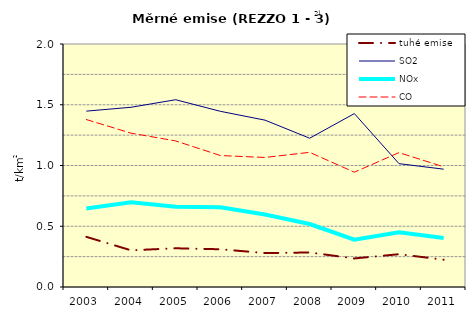
| Category | tuhé emise | SO2 | NOx | CO |
|---|---|---|---|---|
| 2003.0 | 0.413 | 1.447 | 0.646 | 1.378 |
| 2004.0 | 0.302 | 1.479 | 0.697 | 1.266 |
| 2005.0 | 0.319 | 1.541 | 0.661 | 1.202 |
| 2006.0 | 0.311 | 1.446 | 0.657 | 1.082 |
| 2007.0 | 0.279 | 1.373 | 0.596 | 1.066 |
| 2008.0 | 0.284 | 1.225 | 0.518 | 1.108 |
| 2009.0 | 0.235 | 1.427 | 0.389 | 0.945 |
| 2010.0 | 0.27 | 1.015 | 0.451 | 1.106 |
| 2011.0 | 0.225 | 0.97 | 0.404 | 0.989 |